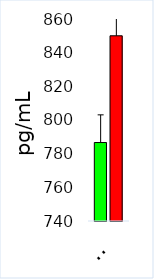
| Category | Control | ASD |
|---|---|---|
| MLTN | 786.619 | 850.023 |